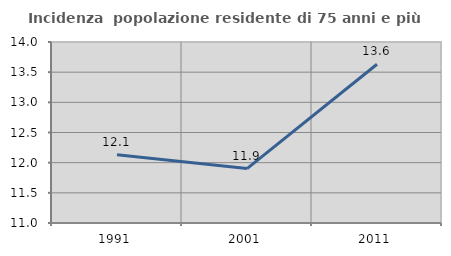
| Category | Incidenza  popolazione residente di 75 anni e più |
|---|---|
| 1991.0 | 12.13 |
| 2001.0 | 11.902 |
| 2011.0 | 13.632 |